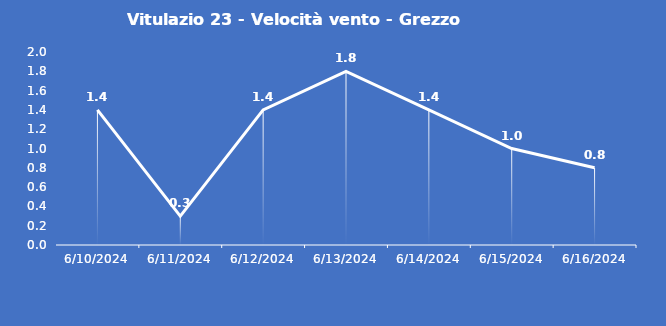
| Category | Vitulazio 23 - Velocità vento - Grezzo (m/s) |
|---|---|
| 6/10/24 | 1.4 |
| 6/11/24 | 0.3 |
| 6/12/24 | 1.4 |
| 6/13/24 | 1.8 |
| 6/14/24 | 1.4 |
| 6/15/24 | 1 |
| 6/16/24 | 0.8 |